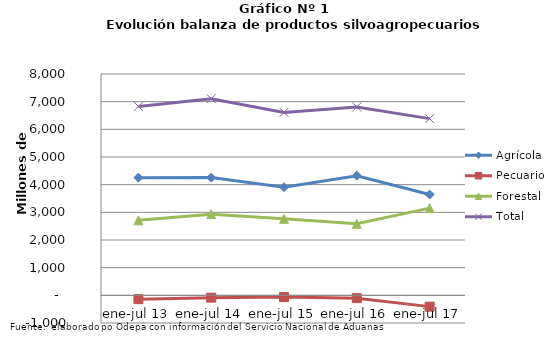
| Category | Agrícola | Pecuario | Forestal | Total |
|---|---|---|---|---|
| ene-jul 13 | 4254119 | -137910 | 2710715 | 6826924 |
| ene-jul 14 | 4255864 | -83215 | 2933416 | 7106065 |
| ene-jul 15 | 3909471 | -62580 | 2766202 | 6613093 |
| ene-jul 16 | 4324850 | -101664 | 2584315 | 6807501 |
| ene-jul 17 | 3643193 | -408296 | 3152439 | 6387336 |